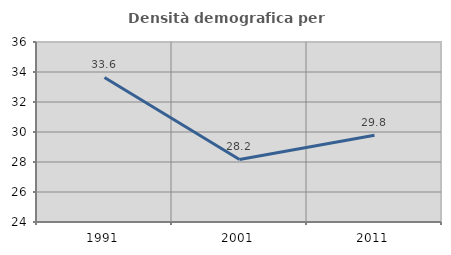
| Category | Densità demografica |
|---|---|
| 1991.0 | 33.639 |
| 2001.0 | 28.168 |
| 2011.0 | 29.789 |